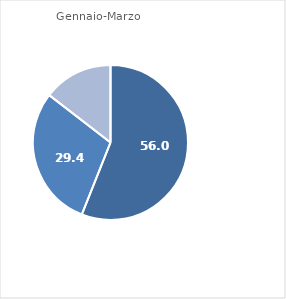
| Category | Series 0 |
|---|---|
| 0 | 56.03 |
| 1 | 29.431 |
| 2 | 14.539 |